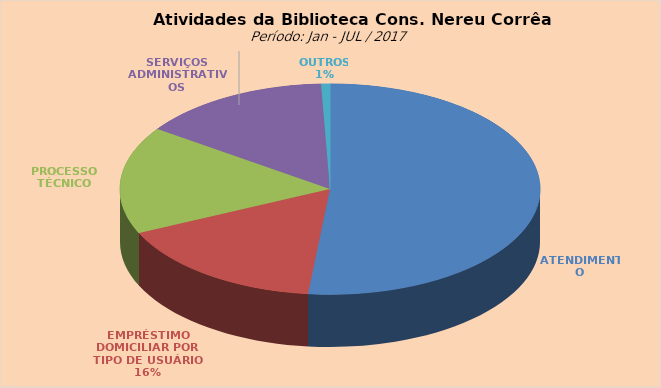
| Category | Series 0 |
|---|---|
| ATENDIMENTO | 8364 |
| EMPRÉSTIMO DOMICILIAR POR TIPO DE USUÁRIO | 2668 |
| PROCESSO TÉCNICO | 2674 |
| SERVIÇOS ADMINISTRATIVOS | 2372 |
| OUTROS | 110 |